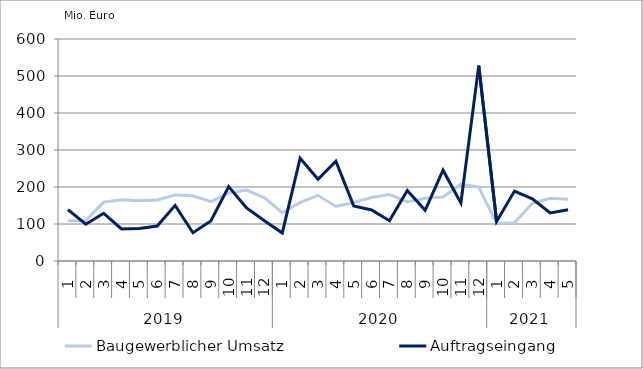
| Category | Baugewerblicher Umsatz | Auftragseingang |
|---|---|---|
| 0 | 108616.605 | 139065.287 |
| 1 | 109331.58 | 99318.609 |
| 2 | 159117.81 | 129002.041 |
| 3 | 165654.287 | 86579.2 |
| 4 | 162976.056 | 87644.362 |
| 5 | 165026.188 | 94463.186 |
| 6 | 178622.938 | 150345.08 |
| 7 | 176074.101 | 76434.317 |
| 8 | 160663.041 | 108444.162 |
| 9 | 183589.485 | 201122.697 |
| 10 | 191777.213 | 143514.792 |
| 11 | 170885.223 | 108780.022 |
| 12 | 130445.562 | 75891.481 |
| 13 | 158433.655 | 277923.85 |
| 14 | 177529.832 | 220973.626 |
| 15 | 147259.799 | 269936.091 |
| 16 | 157965.891 | 149072.895 |
| 17 | 171647.778 | 137984.76 |
| 18 | 179530.732 | 108645.965 |
| 19 | 159480.457 | 190771.468 |
| 20 | 169638.111 | 136988.906 |
| 21 | 173040.053 | 245341.603 |
| 22 | 207619.085 | 156647.224 |
| 23 | 199947.086 | 528166.004 |
| 24 | 101295.895 | 106850.127 |
| 25 | 103236.543 | 188883.434 |
| 26 | 156172.725 | 168204.42 |
| 27 | 169257.088 | 130052.073 |
| 28 | 166897.821 | 138492.214 |